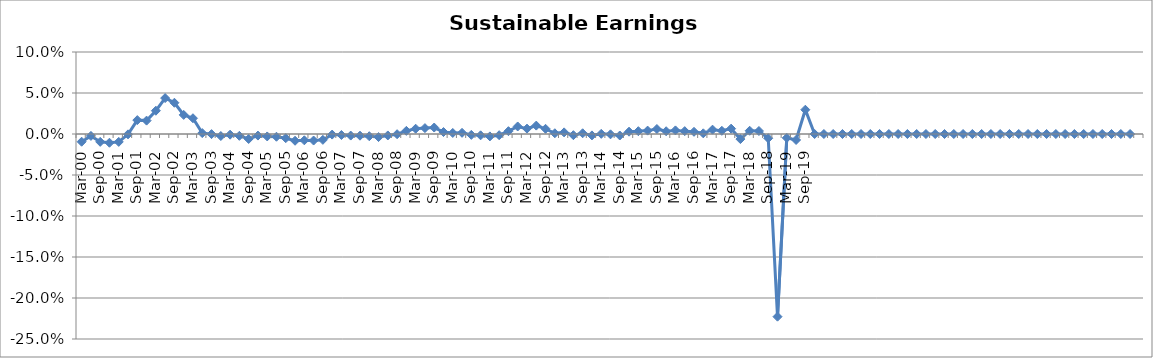
| Category | Sustainable Earnings Indicator |
|---|---|
| Mar-00 | -0.009 |
| Jun-00 | -0.002 |
| Sep-00 | -0.01 |
| Dec-00 | -0.011 |
| Mar-01 | -0.01 |
| Jun-01 | 0 |
| Sep-01 | 0.017 |
| Dec-01 | 0.016 |
| Mar-02 | 0.028 |
| Jun-02 | 0.044 |
| Sep-02 | 0.038 |
| Dec-02 | 0.023 |
| Mar-03 | 0.019 |
| Jun-03 | 0.001 |
| Sep-03 | 0 |
| Dec-03 | -0.002 |
| Mar-04 | -0.001 |
| Jun-04 | -0.002 |
| Sep-04 | -0.006 |
| Dec-04 | -0.002 |
| Mar-05 | -0.003 |
| Jun-05 | -0.003 |
| Sep-05 | -0.005 |
| Dec-05 | -0.008 |
| Mar-06 | -0.008 |
| Jun-06 | -0.008 |
| Sep-06 | -0.007 |
| Dec-06 | -0.001 |
| Mar-07 | -0.001 |
| Jun-07 | -0.002 |
| Sep-07 | -0.002 |
| Dec-07 | -0.003 |
| Mar-08 | -0.004 |
| Jun-08 | -0.002 |
| Sep-08 | 0 |
| Dec-08 | 0.004 |
| Mar-09 | 0.006 |
| Jun-09 | 0.007 |
| Sep-09 | 0.008 |
| Dec-09 | 0.002 |
| Mar-10 | 0.001 |
| Jun-10 | 0.001 |
| Sep-10 | -0.001 |
| Dec-10 | -0.002 |
| Mar-11 | -0.003 |
| Jun-11 | -0.001 |
| Sep-11 | 0.003 |
| Dec-11 | 0.009 |
| Mar-12 | 0.007 |
| Jun-12 | 0.01 |
| Sep-12 | 0.006 |
| Dec-12 | 0.001 |
| Mar-13 | 0.002 |
| Jun-13 | -0.001 |
| Sep-13 | 0.001 |
| Dec-13 | -0.002 |
| Mar-14 | 0 |
| Jun-14 | 0 |
| Sep-14 | -0.002 |
| Dec-14 | 0.003 |
| Mar-15 | 0.003 |
| Jun-15 | 0.004 |
| Sep-15 | 0.006 |
| Dec-15 | 0.003 |
| Mar-16 | 0.004 |
| Jun-16 | 0.003 |
| Sep-16 | 0.003 |
| Dec-16 | 0.001 |
| Mar-17 | 0.005 |
| Jun-17 | 0.004 |
| Sep-17 | 0.007 |
| Dec-17 | -0.006 |
| Mar-18 | 0.004 |
| Jun-18 | 0.004 |
| Sep-18 | -0.005 |
| Dec-18 | -0.223 |
| Mar-19 | -0.005 |
| Jun-19 | -0.007 |
| Sep-19 | 0.03 |